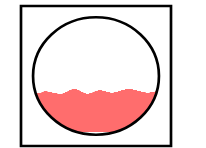
| Category | Series 0 | Series 1 | Series 2 |
|---|---|---|---|
| 0 | 0.32 | 0.05 | 0.63 |